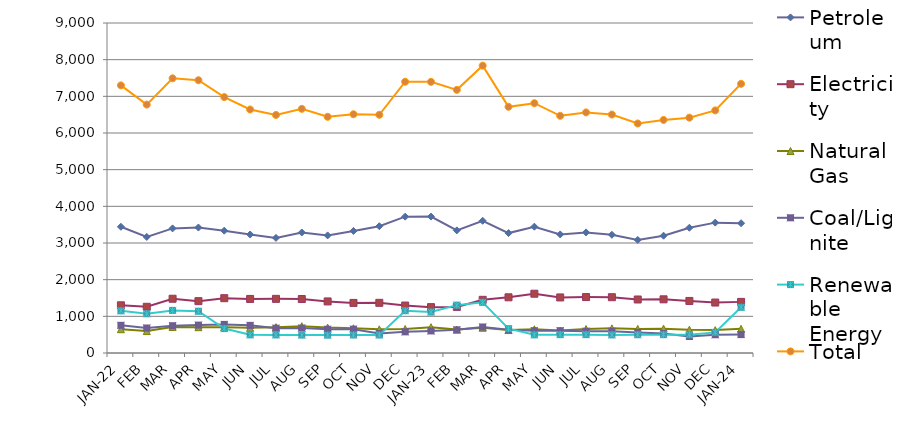
| Category | Petroleum | Electricity | Natural Gas | Coal/Lignite | Renewable Energy | Total |
|---|---|---|---|---|---|---|
| JAN-22 | 3442.689 | 1300.765 | 648.834 | 755.41 | 1150.93 | 7298.628 |
| FEB | 3164.588 | 1259.874 | 597.792 | 681.916 | 1070.84 | 6775.01 |
| MAR | 3398.352 | 1479.647 | 707.847 | 744.358 | 1161.93 | 7492.134 |
| APR | 3421.859 | 1414.281 | 704.034 | 760.704 | 1138.9 | 7439.778 |
| MAY | 3335.863 | 1495.068 | 702.118 | 780.035 | 665.93 | 6979.014 |
| JUN | 3231.96 | 1474.14 | 685.693 | 753.576 | 495.9 | 6641.269 |
| JUL | 3139.511 | 1476.625 | 705.063 | 677.069 | 493.93 | 6492.198 |
| AUG | 3286.421 | 1472.068 | 730.49 | 680.135 | 489.93 | 6659.044 |
| SEP | 3207.285 | 1406.625 | 693.199 | 647.018 | 487.9 | 6442.027 |
| OCT | 3328.74 | 1366.106 | 675.251 | 649.426 | 491.93 | 6511.454 |
| NOV | 3458.032 | 1368.596 | 645.48 | 532.56 | 491.9 | 6496.568 |
| DEC | 3718.684 | 1294.43 | 653.876 | 576.872 | 1153.93 | 7397.792 |
| JAN-23 | 3720.282 | 1250.835 | 703.839 | 601.984 | 1118 | 7394.94 |
| FEB | 3344.018 | 1257.502 | 638.9 | 631.527 | 1304.84 | 7176.787 |
| MAR | 3605.898 | 1450.559 | 689.058 | 709.306 | 1381.93 | 7836.751 |
| APR | 3270.627 | 1518.962 | 625.991 | 635.38 | 662.9 | 6713.859 |
| MAY | 3445.081 | 1616.899 | 646.913 | 607.928 | 495.92 | 6812.739 |
| JUN | 3233.673 | 1515.082 | 610.512 | 607.951 | 500.89 | 6468.109 |
| JUL | 3288.282 | 1525.458 | 652.616 | 594.202 | 500.92 | 6561.478 |
| AUG | 3223.791 | 1522.089 | 671.614 | 592.08 | 494 | 6503.574 |
| SEP | 3083.681 | 1459.194 | 656.848 | 560.669 | 499 | 6259.393 |
| OCT | 3199.053 | 1463.964 | 663.242 | 529.951 | 499.76 | 6355.969 |
| NOV | 3416.303 | 1419.69 | 635.658 | 449.322 | 497.74 | 6418.713 |
| DEC | 3555.269 | 1376.034 | 624.184 | 497.748 | 562.556 | 6615.792 |
| JAN-24 | 3539.367 | 1394.316 | 659.663 | 501.953 | 1245.93 | 7341.23 |